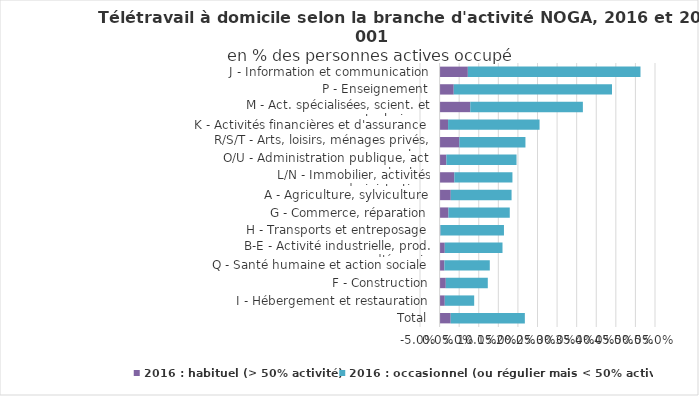
| Category | 2016 : habituel (> 50% activité) | 2016 : occasionnel (ou régulier mais < 50% activité) |
|---|---|---|
| Total | 0.028 | 0.189 |
| I - Hébergement et restauration | 0.013 | 0.075 |
| F - Construction | 0.016 | 0.107 |
| Q - Santé humaine et action sociale | 0.012 | 0.116 |
| B-E - Activité industrielle, prod. d'énergie | 0.013 | 0.147 |
| H - Transports et entreposage | 0.002 | 0.162 |
| G - Commerce, réparation | 0.023 | 0.157 |
| A - Agriculture, sylviculture | 0.029 | 0.155 |
| L/N - Immobilier, activités administratives | 0.038 | 0.148 |
| O/U - Administration publique, act. extra-ter. | 0.017 | 0.179 |
| R/S/T - Arts, loisirs, ménages privés, autres | 0.051 | 0.169 |
| K - Activités financières et d'assurance | 0.022 | 0.234 |
| M - Act. spécialisées, scient. et techniques | 0.078 | 0.287 |
| P - Enseignement | 0.036 | 0.404 |
| J - Information et communication | 0.072 | 0.441 |